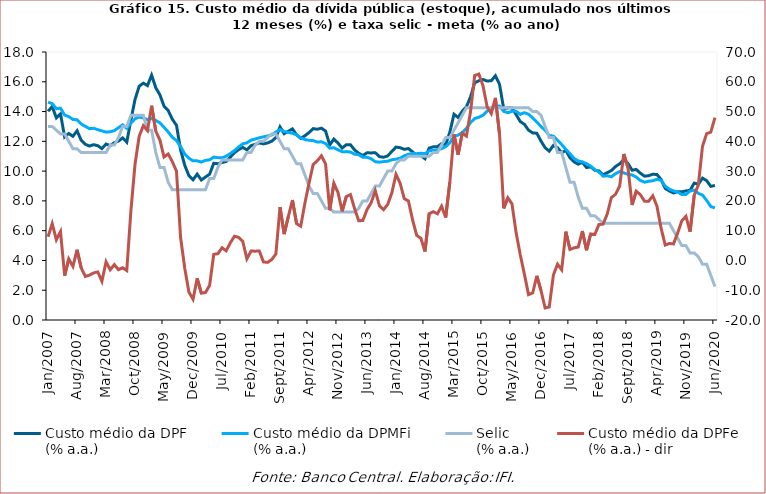
| Category | Custo médio da DPF
(% a.a.) | Custo médio da DPMFi
(% a.a.) | Selic
(% a.a.) |
|---|---|---|---|
| 2007-01-31 | 14.018 | 14.633 | 13 |
| 2007-02-28 | 14.337 | 14.53 | 13 |
| 2007-03-31 | 13.577 | 14.195 | 12.75 |
| 2007-04-30 | 13.844 | 14.225 | 12.5 |
| 2007-05-31 | 12.296 | 13.762 | 12.5 |
| 2007-06-30 | 12.526 | 13.661 | 12 |
| 2007-07-31 | 12.338 | 13.471 | 11.5 |
| 2007-08-31 | 12.71 | 13.447 | 11.5 |
| 2007-09-30 | 12.071 | 13.161 | 11.25 |
| 2007-10-31 | 11.798 | 13.005 | 11.25 |
| 2007-11-30 | 11.684 | 12.85 | 11.25 |
| 2007-12-31 | 11.774 | 12.876 | 11.25 |
| 2008-01-31 | 11.709 | 12.783 | 11.25 |
| 2008-02-29 | 11.511 | 12.703 | 11.25 |
| 2008-03-31 | 11.818 | 12.617 | 11.25 |
| 2008-04-30 | 11.713 | 12.644 | 11.75 |
| 2008-05-31 | 11.909 | 12.717 | 11.75 |
| 2008-06-30 | 12.016 | 12.915 | 12.25 |
| 2008-07-31 | 12.231 | 13.109 | 13 |
| 2008-08-31 | 11.945 | 12.874 | 13 |
| 2008-09-30 | 13.442 | 13.216 | 13.75 |
| 2008-10-31 | 14.818 | 13.516 | 13.75 |
| 2008-11-30 | 15.706 | 13.634 | 13.75 |
| 2008-12-31 | 15.906 | 13.565 | 13.75 |
| 2009-01-31 | 15.744 | 13.459 | 12.75 |
| 2009-02-28 | 16.444 | 13.538 | 12.75 |
| 2009-03-31 | 15.598 | 13.4 | 11.25 |
| 2009-04-30 | 15.126 | 13.241 | 10.25 |
| 2009-05-31 | 14.358 | 12.942 | 10.25 |
| 2009-06-30 | 14.069 | 12.634 | 9.25 |
| 2009-07-31 | 13.482 | 12.269 | 8.75 |
| 2009-08-31 | 13.077 | 12.056 | 8.75 |
| 2009-09-30 | 11.423 | 11.645 | 8.75 |
| 2009-10-31 | 10.391 | 11.146 | 8.75 |
| 2009-11-30 | 9.694 | 10.863 | 8.75 |
| 2009-12-31 | 9.422 | 10.688 | 8.75 |
| 2010-01-31 | 9.797 | 10.69 | 8.75 |
| 2010-02-28 | 9.401 | 10.61 | 8.75 |
| 2010-03-31 | 9.603 | 10.72 | 8.75 |
| 2010-04-30 | 9.792 | 10.76 | 9.5 |
| 2010-05-31 | 10.526 | 10.94 | 9.5 |
| 2010-06-30 | 10.495 | 10.9 | 10.25 |
| 2010-07-31 | 10.579 | 10.89 | 10.75 |
| 2010-08-31 | 10.647 | 11 | 10.75 |
| 2010-09-30 | 10.94 | 11.18 | 10.75 |
| 2010-10-31 | 11.234 | 11.38 | 10.75 |
| 2010-11-30 | 11.448 | 11.62 | 10.75 |
| 2010-12-31 | 11.593 | 11.83 | 10.75 |
| 2011-01-31 | 11.428 | 11.9 | 11.25 |
| 2011-02-28 | 11.713 | 12.08 | 11.25 |
| 2011-03-31 | 11.795 | 12.155 | 11.75 |
| 2011-04-30 | 11.893 | 12.24 | 12 |
| 2011-05-31 | 11.83 | 12.3 | 12 |
| 2011-06-30 | 11.892 | 12.36 | 12.25 |
| 2011-07-31 | 12.011 | 12.43 | 12.5 |
| 2011-08-31 | 12.252 | 12.62 | 12.5 |
| 2011-09-30 | 12.968 | 12.79 | 12 |
| 2011-10-31 | 12.515 | 12.66 | 11.5 |
| 2011-11-30 | 12.675 | 12.6 | 11.5 |
| 2011-12-31 | 12.835 | 12.54 | 11 |
| 2012-01-31 | 12.436 | 12.44 | 10.5 |
| 2012-02-29 | 12.204 | 12.23 | 10.5 |
| 2012-03-31 | 12.373 | 12.12 | 9.75 |
| 2012-04-30 | 12.59 | 12.07 | 9 |
| 2012-05-31 | 12.853 | 12.05 | 8.5 |
| 2012-06-30 | 12.815 | 11.95 | 8.5 |
| 2012-07-31 | 12.883 | 11.97 | 8 |
| 2012-08-31 | 12.691 | 11.85 | 7.5 |
| 2012-09-30 | 11.758 | 11.54 | 7.5 |
| 2012-10-31 | 12.15 | 11.57 | 7.25 |
| 2012-11-30 | 11.882 | 11.43 | 7.25 |
| 2012-12-31 | 11.547 | 11.3 | 7.25 |
| 2013-01-31 | 11.771 | 11.31 | 7.25 |
| 2013-02-28 | 11.776 | 11.28 | 7.25 |
| 2013-03-31 | 11.422 | 11.14 | 7.25 |
| 2013-04-30 | 11.201 | 11.1 | 7.5 |
| 2013-05-31 | 11.044 | 10.93 | 8 |
| 2013-06-30 | 11.23 | 10.93 | 8 |
| 2013-07-31 | 11.222 | 10.83 | 8.5 |
| 2013-08-31 | 11.236 | 10.63 | 9 |
| 2013-09-30 | 10.973 | 10.6 | 9 |
| 2013-10-31 | 10.933 | 10.637 | 9.5 |
| 2013-11-30 | 11.021 | 10.663 | 10 |
| 2013-12-31 | 11.325 | 10.763 | 10 |
| 2014-01-31 | 11.613 | 10.805 | 10.5 |
| 2014-02-28 | 11.574 | 10.867 | 10.75 |
| 2014-03-31 | 11.462 | 11.027 | 10.75 |
| 2014-04-30 | 11.516 | 11.131 | 11 |
| 2014-05-31 | 11.293 | 11.182 | 11 |
| 2014-06-30 | 11.052 | 11.173 | 11 |
| 2014-07-31 | 11.042 | 11.197 | 11 |
| 2014-08-31 | 10.832 | 11.175 | 11 |
| 2014-09-30 | 11.544 | 11.356 | 11 |
| 2014-10-31 | 11.63 | 11.391 | 11.25 |
| 2014-11-30 | 11.64 | 11.435 | 11.25 |
| 2014-12-31 | 11.842 | 11.512 | 11.75 |
| 2015-01-31 | 11.779 | 11.643 | 12.25 |
| 2015-02-27 | 12.616 | 11.909 | 12.25 |
| 2015-03-31 | 13.821 | 12.323 | 12.75 |
| 2015-04-30 | 13.599 | 12.419 | 13.25 |
| 2015-05-31 | 14.029 | 12.579 | 13.75 |
| 2015-06-30 | 14.314 | 12.877 | 14.25 |
| 2015-07-31 | 14.987 | 13.263 | 14.25 |
| 2015-08-31 | 15.934 | 13.532 | 14.25 |
| 2015-09-30 | 16.067 | 13.618 | 14.25 |
| 2015-10-31 | 16.152 | 13.754 | 14.25 |
| 2015-11-30 | 16.051 | 14.029 | 14.25 |
| 2015-12-31 | 16.071 | 14.241 | 14.25 |
| 2016-01-31 | 16.405 | 14.346 | 14.25 |
| 2016-02-29 | 15.826 | 14.372 | 14.25 |
| 2016-03-31 | 14.189 | 14.015 | 14.25 |
| 2016-04-30 | 14.248 | 13.92 | 14.25 |
| 2016-05-31 | 14.246 | 14.016 | 14.25 |
| 2016-06-30 | 13.798 | 14.017 | 14.25 |
| 2016-07-31 | 13.329 | 13.814 | 14.25 |
| 2016-08-31 | 13.146 | 13.924 | 14.25 |
| 2016-09-30 | 12.749 | 13.82 | 14.25 |
| 2016-10-31 | 12.564 | 13.578 | 14 |
| 2016-11-30 | 12.544 | 13.296 | 14 |
| 2016-12-31 | 12.017 | 12.996 | 13.75 |
| 2017-01-31 | 11.572 | 12.739 | 13 |
| 2017-02-28 | 11.34 | 12.394 | 12.25 |
| 2017-03-31 | 11.724 | 12.351 | 12.25 |
| 2017-04-30 | 11.573 | 12.068 | 11.25 |
| 2017-05-31 | 11.226 | 11.784 | 11.25 |
| 2017-06-30 | 11.399 | 11.466 | 10.25 |
| 2017-07-31 | 10.892 | 11.168 | 9.25 |
| 2017-08-31 | 10.619 | 10.85 | 9.25 |
| 2017-09-30 | 10.467 | 10.68 | 8.25 |
| 2017-10-31 | 10.591 | 10.617 | 7.5 |
| 2017-11-30 | 10.237 | 10.498 | 7.5 |
| 2017-12-31 | 10.289 | 10.339 | 7 |
| 2018-01-31 | 10.057 | 10.104 | 7 |
| 2018-02-28 | 10.009 | 9.934 | 6.75 |
| 2018-03-31 | 9.748 | 9.659 | 6.5 |
| 2018-04-30 | 9.894 | 9.686 | 6.5 |
| 2018-05-31 | 10.039 | 9.617 | 6.5 |
| 2018-06-30 | 10.305 | 9.83 | 6.5 |
| 2018-07-31 | 10.492 | 9.971 | 6.5 |
| 2018-08-31 | 10.76 | 9.878 | 6.5 |
| 2018-09-30 | 10.515 | 9.78 | 6.5 |
| 2018-10-31 | 10.061 | 9.743 | 6.5 |
| 2018-11-30 | 10.112 | 9.6 | 6.5 |
| 2018-12-31 | 9.859 | 9.371 | 6.5 |
| 2019-01-31 | 9.661 | 9.254 | 6.5 |
| 2019-02-28 | 9.69 | 9.318 | 6.5 |
| 2019-03-31 | 9.792 | 9.355 | 6.5 |
| 2019-04-30 | 9.769 | 9.449 | 6.5 |
| 2019-05-31 | 9.44 | 9.385 | 6.5 |
| 2019-06-30 | 8.833 | 8.987 | 6.5 |
| 2019-07-31 | 8.665 | 8.788 | 6.5 |
| 2019-08-31 | 8.536 | 8.669 | 6 |
| 2019-09-30 | 8.614 | 8.594 | 5.5 |
| 2019-10-31 | 8.61 | 8.431 | 5 |
| 2019-11-30 | 8.67 | 8.435 | 5 |
| 2019-12-31 | 8.705 | 8.665 | 4.5 |
| 2020-01-31 | 9.195 | 8.723 | 4.5 |
| 2020-02-29 | 9.121 | 8.505 | 4.25 |
| 2020-03-31 | 9.527 | 8.392 | 3.75 |
| 2020-04-30 | 9.355 | 8.031 | 3.75 |
| 2020-05-31 | 8.976 | 7.621 | 3 |
| 2020-06-30 | 9.038 | 7.524 | 2.25 |